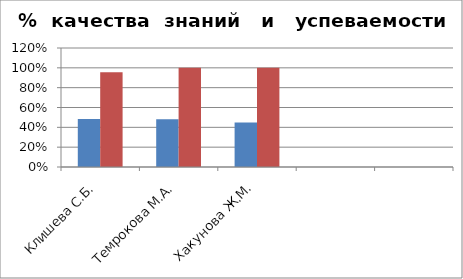
| Category | Series 0 | 2 |
|---|---|---|
| Клишева С.Б. | 0.485 | 0.956 |
| Темрокова М.А. | 0.482 | 1 |
| Хакунова Ж.М. | 0.45 | 1 |